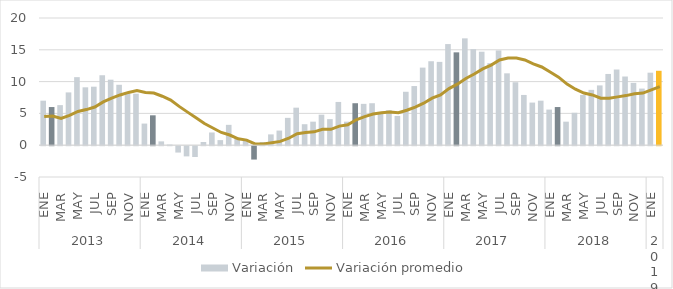
| Category | Variación |
|---|---|
| 0 | 7 |
| 1 | 6 |
| 2 | 6.3 |
| 3 | 8.3 |
| 4 | 10.7 |
| 5 | 9.1 |
| 6 | 9.2 |
| 7 | 11 |
| 8 | 10.3 |
| 9 | 9.5 |
| 10 | 8.1 |
| 11 | 8.1 |
| 12 | 3.4 |
| 13 | 4.7 |
| 14 | 0.6 |
| 15 | 0.1 |
| 16 | -1 |
| 17 | -1.6 |
| 18 | -1.7 |
| 19 | 0.5 |
| 20 | 2 |
| 21 | 0.8 |
| 22 | 3.2 |
| 23 | 1.1 |
| 24 | 0.9 |
| 25 | -2.1 |
| 26 | 0.5 |
| 27 | 1.7 |
| 28 | 2.3 |
| 29 | 4.3 |
| 30 | 5.9 |
| 31 | 3.3 |
| 32 | 3.7 |
| 33 | 4.8 |
| 34 | 4.1 |
| 35 | 6.8 |
| 36 | 3.7 |
| 37 | 6.6 |
| 38 | 6.5 |
| 39 | 6.6 |
| 40 | 5 |
| 41 | 5.5 |
| 42 | 4.6 |
| 43 | 8.4 |
| 44 | 9.3 |
| 45 | 12.2 |
| 46 | 13.2 |
| 47 | 13.1 |
| 48 | 15.9 |
| 49 | 14.6 |
| 50 | 16.8 |
| 51 | 15.1 |
| 52 | 14.7 |
| 53 | 12.9 |
| 54 | 14.9 |
| 55 | 11.3 |
| 56 | 9.9 |
| 57 | 7.9 |
| 58 | 6.7 |
| 59 | 7 |
| 60 | 5.6 |
| 61 | 6 |
| 62 | 3.7 |
| 63 | 5.1 |
| 64 | 7.9 |
| 65 | 8.7 |
| 66 | 9.4 |
| 67 | 11.2 |
| 68 | 11.9 |
| 69 | 10.8 |
| 70 | 9.8 |
| 71 | 8.9 |
| 72 | 11.4 |
| 73 | 11.7 |